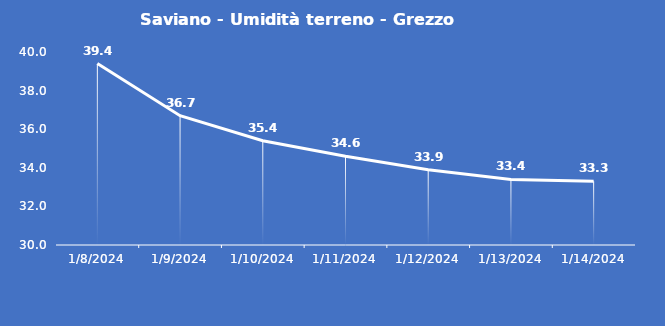
| Category | Saviano - Umidità terreno - Grezzo (%VWC) |
|---|---|
| 1/8/24 | 39.4 |
| 1/9/24 | 36.7 |
| 1/10/24 | 35.4 |
| 1/11/24 | 34.6 |
| 1/12/24 | 33.9 |
| 1/13/24 | 33.4 |
| 1/14/24 | 33.3 |